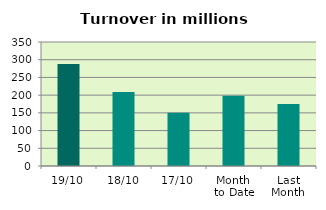
| Category | Series 0 |
|---|---|
| 19/10 | 288.077 |
| 18/10 | 208.94 |
| 17/10 | 149.995 |
| Month 
to Date | 198.092 |
| Last
Month | 174.723 |